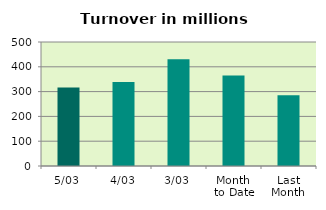
| Category | Series 0 |
|---|---|
| 5/03 | 316.77 |
| 4/03 | 339.159 |
| 3/03 | 430.896 |
| Month 
to Date | 365.116 |
| Last
Month | 285.08 |